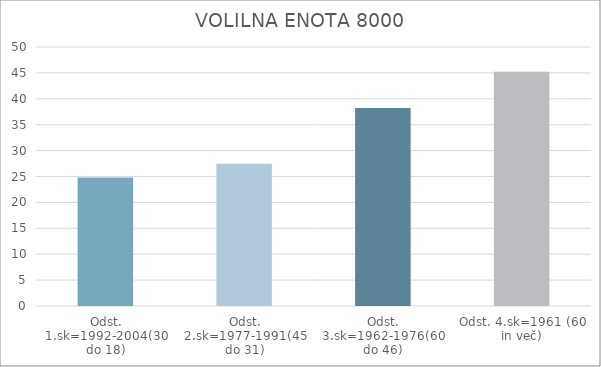
| Category | Series 0 |
|---|---|
| Odst. 1.sk=1992-2004(30 do 18) | 24.8 |
| Odst. 2.sk=1977-1991(45 do 31) | 27.46 |
| Odst. 3.sk=1962-1976(60 do 46) | 38.22 |
| Odst. 4.sk=1961 (60 in več) | 45.2 |